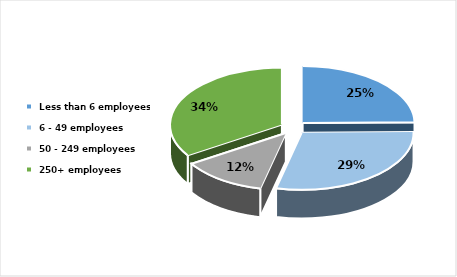
| Category | Series 0 |
|---|---|
|  Less than 6 employees | 0.247 |
|  6 - 49 employees | 0.289 |
|  50 - 249 employees | 0.123 |
|  250+ employees | 0.341 |